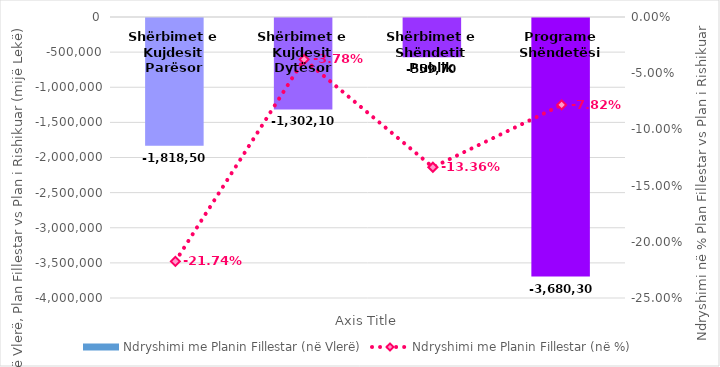
| Category | Ndryshimi me Planin Fillestar (në Vlerë) |
|---|---|
| Shërbimet e Kujdesit Parësor | -1818500 |
| Shërbimet e Kujdesit Dytësor | -1302100 |
| Shërbimet e Shëndetit Publik | -559700 |
| Programe Shëndetësi | -3680300 |